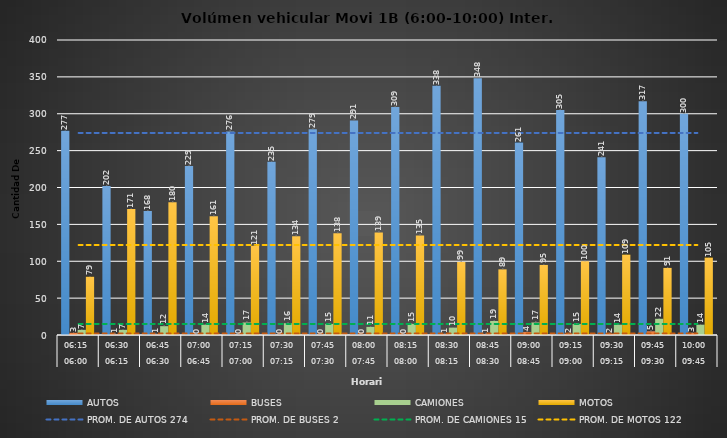
| Category | AUTOS | BUSES | CAMIONES | MOTOS |
|---|---|---|---|---|
| 0 | 277 | 3 | 7 | 79 |
| 1 | 202 | 1 | 7 | 171 |
| 2 | 168 | 1 | 12 | 180 |
| 3 | 229 | 0 | 14 | 161 |
| 4 | 276 | 0 | 17 | 121 |
| 5 | 235 | 0 | 16 | 134 |
| 6 | 279 | 0 | 15 | 138 |
| 7 | 291 | 0 | 11 | 139 |
| 8 | 309 | 0 | 15 | 135 |
| 9 | 338 | 1 | 10 | 99 |
| 10 | 348 | 1 | 19 | 89 |
| 11 | 261 | 4 | 17 | 95 |
| 12 | 305 | 2 | 15 | 100 |
| 13 | 241 | 2 | 14 | 109 |
| 14 | 317 | 5 | 22 | 91 |
| 15 | 300 | 3 | 14 | 105 |